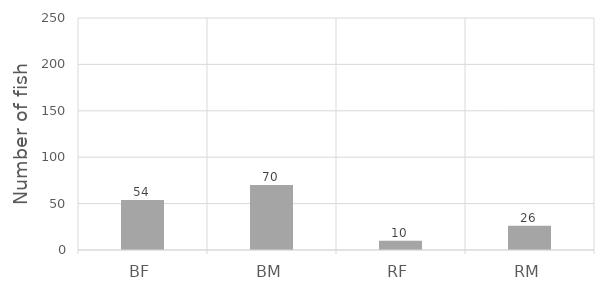
| Category | Series 0 |
|---|---|
| BF | 54 |
| BM | 70 |
| RF | 10 |
| RM | 26 |